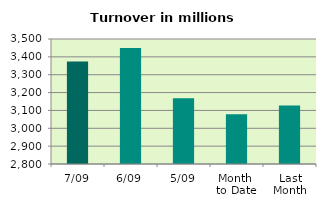
| Category | Series 0 |
|---|---|
| 7/09 | 3374.684 |
| 6/09 | 3449.329 |
| 5/09 | 3167.68 |
| Month 
to Date | 3078.884 |
| Last
Month | 3127.739 |